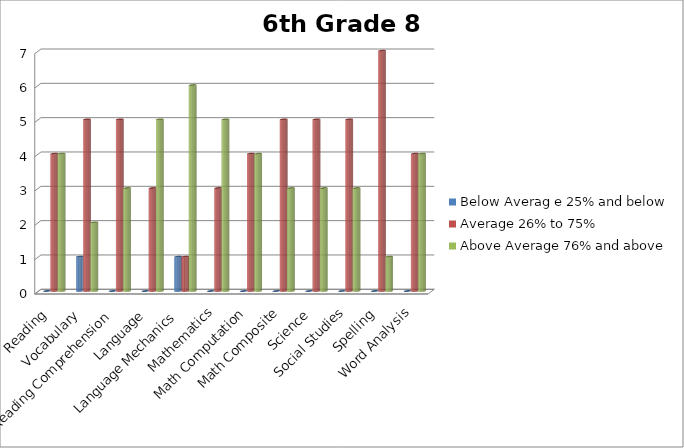
| Category | Below Averag e 25% and below | Average 26% to 75% | Above Average 76% and above |
|---|---|---|---|
| Reading  | 0 | 4 | 4 |
| Vocabulary | 1 | 5 | 2 |
| Reading Comprehension | 0 | 5 | 3 |
| Language | 0 | 3 | 5 |
| Language Mechanics | 1 | 1 | 6 |
| Mathematics | 0 | 3 | 5 |
| Math Computation | 0 | 4 | 4 |
| Math Composite | 0 | 5 | 3 |
| Science | 0 | 5 | 3 |
| Social Studies | 0 | 5 | 3 |
| Spelling | 0 | 7 | 1 |
| Word Analysis | 0 | 4 | 4 |